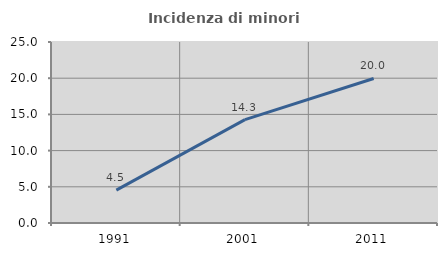
| Category | Incidenza di minori stranieri |
|---|---|
| 1991.0 | 4.545 |
| 2001.0 | 14.286 |
| 2011.0 | 19.96 |